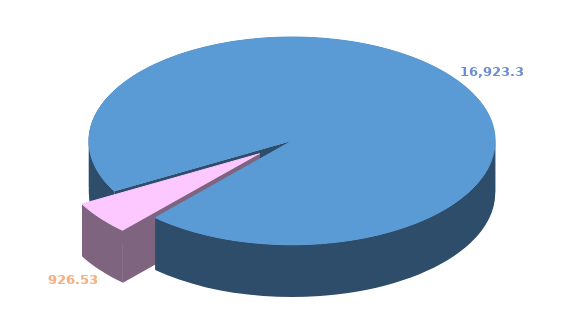
| Category | Series 0 |
|---|---|
| 0 | 16923.342 |
| 1 | 926.525 |